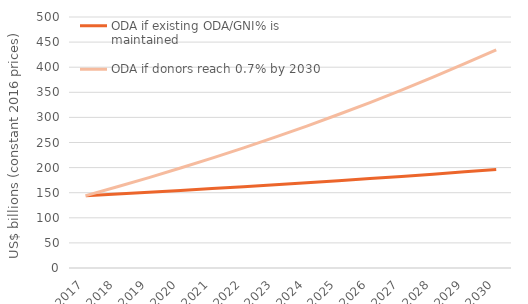
| Category | ODA if existing ODA/GNI% is maintained | ODA if donors reach 0.7% by 2030 |
|---|---|---|
| 2017.0 | 144165.711 | 144165.711 |
| 2018.0 | 147538.521 | 161795.184 |
| 2019.0 | 151003.528 | 180103.147 |
| 2020.0 | 154563.981 | 199115.371 |
| 2021.0 | 158223.294 | 218858.931 |
| 2022.0 | 161985.065 | 239362.298 |
| 2023.0 | 165853.084 | 260655.45 |
| 2024.0 | 169831.352 | 282769.988 |
| 2025.0 | 173924.093 | 305739.264 |
| 2026.0 | 178135.775 | 329598.525 |
| 2027.0 | 182471.13 | 354385.07 |
| 2028.0 | 186935.174 | 380138.423 |
| 2029.0 | 191533.23 | 406900.521 |
| 2030.0 | 196270.956 | 434715.931 |